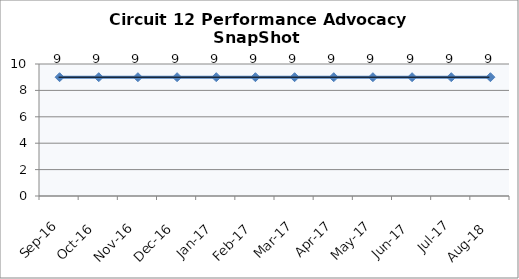
| Category | Circuit 12 |
|---|---|
| Sep-16 | 9 |
| Oct-16 | 9 |
| Nov-16 | 9 |
| Dec-16 | 9 |
| Jan-17 | 9 |
| Feb-17 | 9 |
| Mar-17 | 9 |
| Apr-17 | 9 |
| May-17 | 9 |
| Jun-17 | 9 |
| Jul-17 | 9 |
| Aug-18 | 9 |